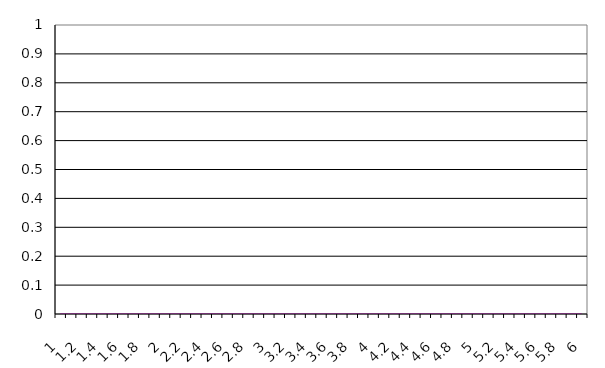
| Category | Series 0 |
|---|---|
| 1.0 | 0 |
| 1.1 | 0 |
| 1.2000000000000002 | 0 |
| 1.3000000000000003 | 0 |
| 1.4000000000000004 | 0 |
| 1.5000000000000004 | 0 |
| 1.6000000000000005 | 0 |
| 1.7000000000000006 | 0 |
| 1.8000000000000007 | 0 |
| 1.9000000000000008 | 0 |
| 2.000000000000001 | 0 |
| 2.100000000000001 | 0 |
| 2.200000000000001 | 0 |
| 2.300000000000001 | 0 |
| 2.4000000000000012 | 0 |
| 2.5000000000000013 | 0 |
| 2.6000000000000014 | 0 |
| 2.7000000000000015 | 0 |
| 2.8000000000000016 | 0 |
| 2.9000000000000017 | 0 |
| 3.0000000000000018 | 0 |
| 3.100000000000002 | 0 |
| 3.200000000000002 | 0 |
| 3.300000000000002 | 0 |
| 3.400000000000002 | 0 |
| 3.500000000000002 | 0 |
| 3.6000000000000023 | 0 |
| 3.7000000000000024 | 0 |
| 3.8000000000000025 | 0 |
| 3.9000000000000026 | 0 |
| 4.000000000000003 | 0 |
| 4.100000000000002 | 0 |
| 4.200000000000002 | 0 |
| 4.300000000000002 | 0 |
| 4.400000000000001 | 0 |
| 4.500000000000001 | 0 |
| 4.6000000000000005 | 0 |
| 4.7 | 0 |
| 4.8 | 0 |
| 4.8999999999999995 | 0 |
| 4.999999999999999 | 0 |
| 5.099999999999999 | 0 |
| 5.199999999999998 | 0 |
| 5.299999999999998 | 0 |
| 5.399999999999998 | 0 |
| 5.499999999999997 | 0 |
| 5.599999999999997 | 0 |
| 5.699999999999997 | 0 |
| 5.799999999999996 | 0 |
| 5.899999999999996 | 0 |
| 5.999999999999996 | 0 |